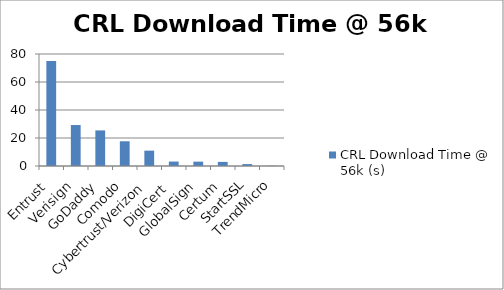
| Category | CRL Download Time @ 56k (s) |
|---|---|
| Entrust | 74.95 |
| Verisign | 29.26 |
| GoDaddy | 25.42 |
| Comodo | 17.66 |
| Cybertrust/Verizon | 10.97 |
| DigiCert  | 3.17 |
| GlobalSign | 3.11 |
| Certum | 2.93 |
| StartSSL | 1.38 |
| TrendMicro | 0.15 |